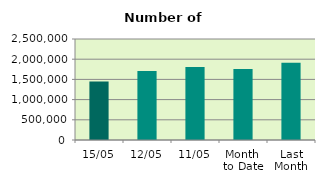
| Category | Series 0 |
|---|---|
| 15/05 | 1447878 |
| 12/05 | 1709600 |
| 11/05 | 1809220 |
| Month 
to Date | 1759412 |
| Last
Month | 1909115.889 |